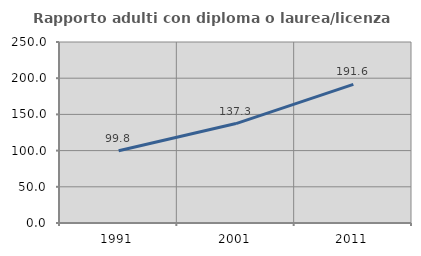
| Category | Rapporto adulti con diploma o laurea/licenza media  |
|---|---|
| 1991.0 | 99.792 |
| 2001.0 | 137.346 |
| 2011.0 | 191.556 |